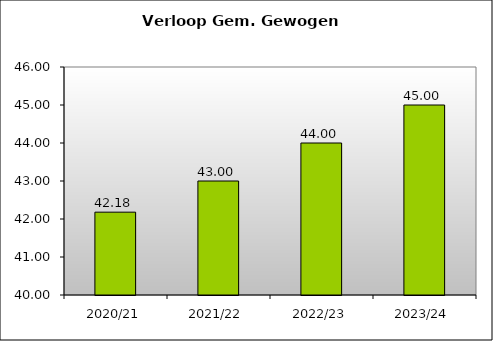
| Category | GGL |
|---|---|
| 2020/21 | 42.18 |
| 2021/22 | 43 |
| 2022/23 | 44 |
| 2023/24 | 45 |